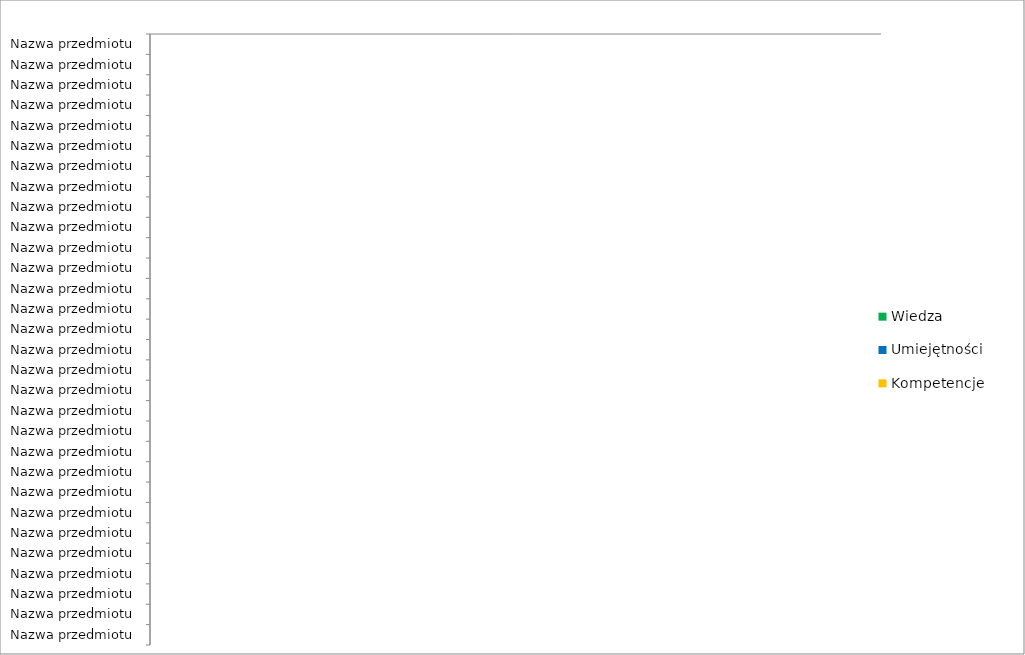
| Category | Wiedza | Umiejętności | Kompetencje |
|---|---|---|---|
| Nazwa przedmiotu | 0 | 0 | 0 |
| Nazwa przedmiotu | 0 | 0 | 0 |
| Nazwa przedmiotu | 0 | 0 | 0 |
| Nazwa przedmiotu | 0 | 0 | 0 |
| Nazwa przedmiotu | 0 | 0 | 0 |
| Nazwa przedmiotu | 0 | 0 | 0 |
| Nazwa przedmiotu | 0 | 0 | 0 |
| Nazwa przedmiotu | 0 | 0 | 0 |
| Nazwa przedmiotu | 0 | 0 | 0 |
| Nazwa przedmiotu | 0 | 0 | 0 |
| Nazwa przedmiotu | 0 | 0 | 0 |
| Nazwa przedmiotu | 0 | 0 | 0 |
| Nazwa przedmiotu | 0 | 0 | 0 |
| Nazwa przedmiotu | 0 | 0 | 0 |
| Nazwa przedmiotu | 0 | 0 | 0 |
| Nazwa przedmiotu | 0 | 0 | 0 |
| Nazwa przedmiotu | 0 | 0 | 0 |
| Nazwa przedmiotu | 0 | 0 | 0 |
| Nazwa przedmiotu | 0 | 0 | 0 |
| Nazwa przedmiotu | 0 | 0 | 0 |
| Nazwa przedmiotu | 0 | 0 | 0 |
| Nazwa przedmiotu | 0 | 0 | 0 |
| Nazwa przedmiotu | 0 | 0 | 0 |
| Nazwa przedmiotu | 0 | 0 | 0 |
| Nazwa przedmiotu | 0 | 0 | 0 |
| Nazwa przedmiotu | 0 | 0 | 0 |
| Nazwa przedmiotu | 0 | 0 | 0 |
| Nazwa przedmiotu | 0 | 0 | 0 |
| Nazwa przedmiotu | 0 | 0 | 0 |
| Nazwa przedmiotu | 0 | 0 | 0 |